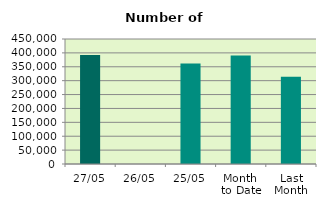
| Category | Series 0 |
|---|---|
| 27/05 | 392358 |
| 26/05 | 0 |
| 25/05 | 362002 |
| Month 
to Date | 390464.111 |
| Last
Month | 313751.158 |